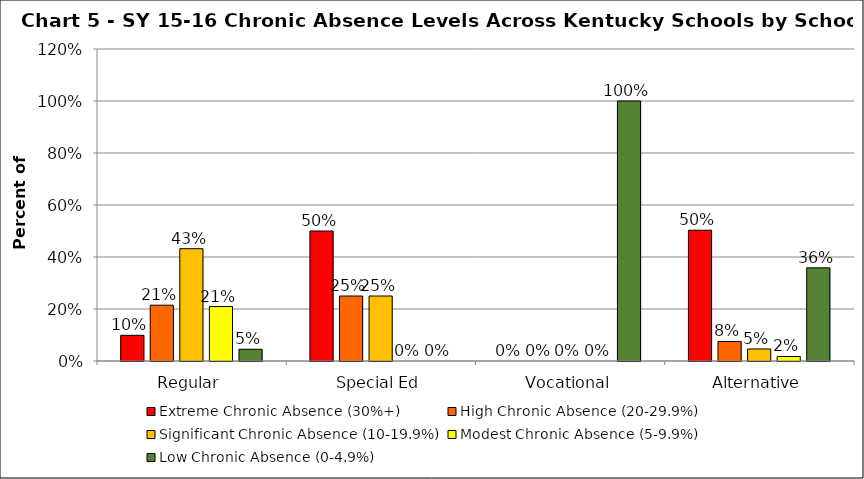
| Category | Extreme Chronic Absence (30%+) | High Chronic Absence (20-29.9%) | Significant Chronic Absence (10-19.9%) | Modest Chronic Absence (5-9.9%) | Low Chronic Absence (0-4.9%) |
|---|---|---|---|---|---|
| 0 | 0.099 | 0.215 | 0.432 | 0.21 | 0.045 |
| 1 | 0.5 | 0.25 | 0.25 | 0 | 0 |
| 2 | 0 | 0 | 0 | 0 | 1 |
| 3 | 0.503 | 0.075 | 0.046 | 0.017 | 0.358 |